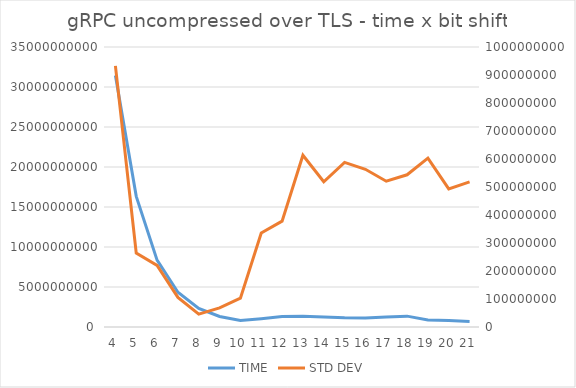
| Category | TIME |
|---|---|
| 4.0 | 31425359528.88 |
| 5.0 | 16330981084.28 |
| 6.0 | 8360943005.54 |
| 7.0 | 4350342785.5 |
| 8.0 | 2325088231.42 |
| 9.0 | 1320265099.84 |
| 10.0 | 802249902.06 |
| 11.0 | 1036732459.12 |
| 12.0 | 1308651428.02 |
| 13.0 | 1359134183.2 |
| 14.0 | 1244060986.64 |
| 15.0 | 1150086009.52 |
| 16.0 | 1127417396.2 |
| 17.0 | 1261679018.62 |
| 18.0 | 1358358525.8 |
| 19.0 | 872052717.14 |
| 20.0 | 798987589.32 |
| 21.0 | 683073116.84 |